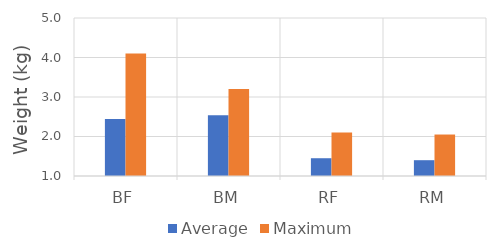
| Category | Average | Maximum |
|---|---|---|
| BF | 2.44 | 4.1 |
| BM | 2.54 | 3.2 |
| RF | 1.45 | 2.1 |
| RM | 1.4 | 2.05 |